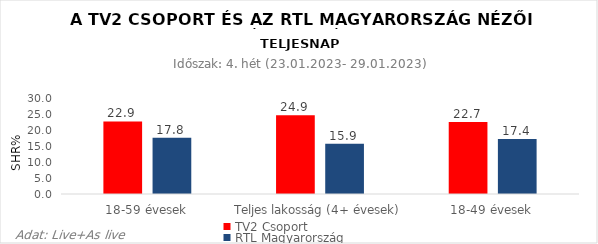
| Category | TV2 Csoport | RTL Magyarország |
|---|---|---|
| 18-59 évesek | 22.9 | 17.8 |
| Teljes lakosság (4+ évesek) | 24.9 | 15.9 |
| 18-49 évesek | 22.7 | 17.4 |